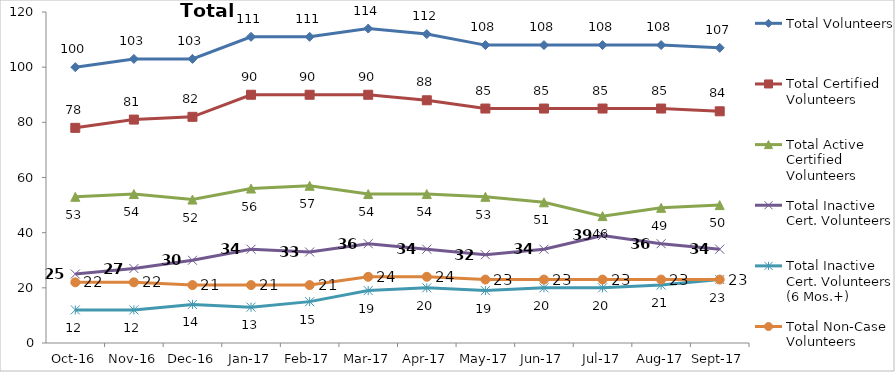
| Category | Total Volunteers | Total Certified Volunteers | Total Active Certified Volunteers | Total Inactive Cert. Volunteers | Total Inactive Cert. Volunteers (6 Mos.+) | Total Non-Case Volunteers |
|---|---|---|---|---|---|---|
| 2016-10-01 | 100 | 78 | 53 | 25 | 12 | 22 |
| 2016-11-01 | 103 | 81 | 54 | 27 | 12 | 22 |
| 2016-12-01 | 103 | 82 | 52 | 30 | 14 | 21 |
| 2017-01-01 | 111 | 90 | 56 | 34 | 13 | 21 |
| 2017-02-01 | 111 | 90 | 57 | 33 | 15 | 21 |
| 2017-03-01 | 114 | 90 | 54 | 36 | 19 | 24 |
| 2017-04-01 | 112 | 88 | 54 | 34 | 20 | 24 |
| 2017-05-01 | 108 | 85 | 53 | 32 | 19 | 23 |
| 2017-06-01 | 108 | 85 | 51 | 34 | 20 | 23 |
| 2017-07-01 | 108 | 85 | 46 | 39 | 20 | 23 |
| 2017-08-01 | 108 | 85 | 49 | 36 | 21 | 23 |
| 2017-09-01 | 107 | 84 | 50 | 34 | 23 | 23 |